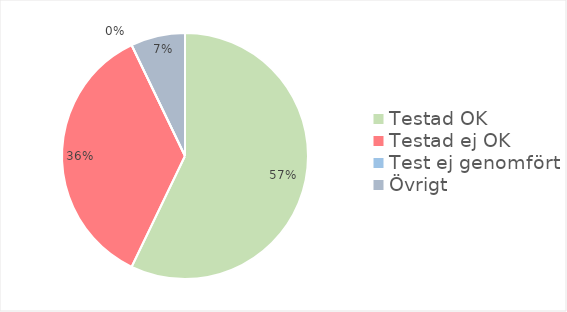
| Category | Series 0 |
|---|---|
| Testad OK | 8 |
| Testad ej OK | 5 |
| Test ej genomfört | 0 |
| Övrigt | 1 |